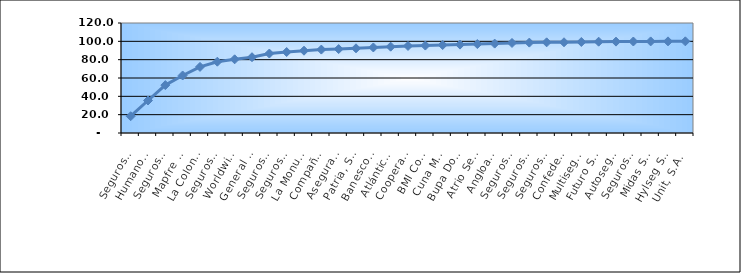
| Category | Series 0 |
|---|---|
| Seguros Universal, S. A. | 18.294 |
| Humano Seguros, S. A. | 35.443 |
| Seguros Reservas, S. A. | 52.255 |
| Mapfre BHD Compañía de Seguros | 62.727 |
| La Colonial, S. A., Compañia De Seguros | 72.118 |
| Seguros Sura, S.A. | 77.793 |
| Worldwide Seguros, S. A. | 80.374 |
| General de Seguros, S. A. | 82.672 |
| Seguros Crecer, S. A. | 86.684 |
| Seguros Pepín, S. A. | 88.327 |
| La Monumental de Seguros, S. A. | 89.763 |
| Compañía Dominicana de Seguros, C. por A. | 91.002 |
| Aseguradora Agropecuaria Dominicana, S. A. | 91.551 |
| Patria, S. A., Compañía de Seguros | 92.401 |
| Banesco Seguros | 93.307 |
| Atlántica Seguros, S. A. | 94.179 |
| Cooperativa Nacional De Seguros, Inc  | 94.952 |
| BMI Compañía de Seguros, S. A. | 95.378 |
| Cuna Mutual Insurance Society Dominicana | 95.962 |
| Bupa Dominicana, S. A. | 96.432 |
| Atrio Seguros S. A. | 97.016 |
| Angloamericana de Seguros, S. A. | 97.526 |
| Seguros La Internacional, S. A. | 98.22 |
| Seguros APS, S.R.L. | 98.615 |
| Seguros Ademi, S.A. | 98.912 |
| Confederación del Canadá Dominicana, S. A. | 98.992 |
| Multiseguros Su, S.A. | 99.297 |
| Futuro Seguros | 99.625 |
| Autoseguro, S. A. | 99.698 |
| Seguros Yunen, S.A. | 99.807 |
| Midas Seguros, S.A. | 99.92 |
| Hylseg Seguros S.A | 99.958 |
| Unit, S.A. | 100 |